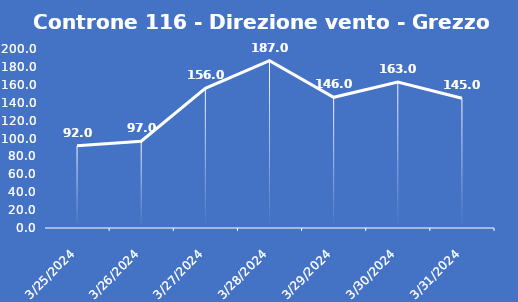
| Category | Controne 116 - Direzione vento - Grezzo (°N) |
|---|---|
| 3/25/24 | 92 |
| 3/26/24 | 97 |
| 3/27/24 | 156 |
| 3/28/24 | 187 |
| 3/29/24 | 146 |
| 3/30/24 | 163 |
| 3/31/24 | 145 |